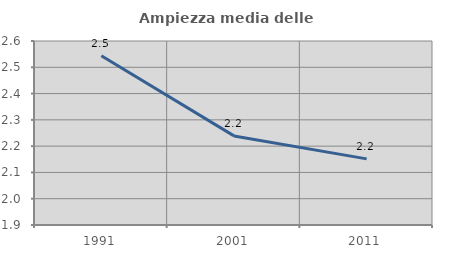
| Category | Ampiezza media delle famiglie |
|---|---|
| 1991.0 | 2.544 |
| 2001.0 | 2.239 |
| 2011.0 | 2.152 |